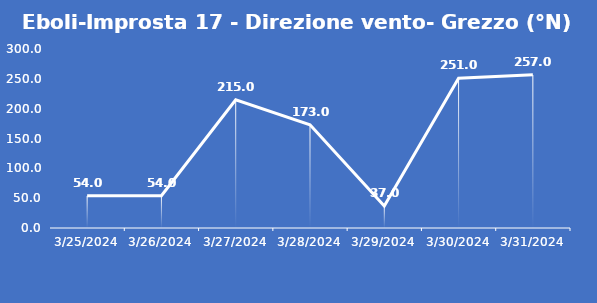
| Category | Eboli-Improsta 17 - Direzione vento- Grezzo (°N) |
|---|---|
| 3/25/24 | 54 |
| 3/26/24 | 54 |
| 3/27/24 | 215 |
| 3/28/24 | 173 |
| 3/29/24 | 37 |
| 3/30/24 | 251 |
| 3/31/24 | 257 |